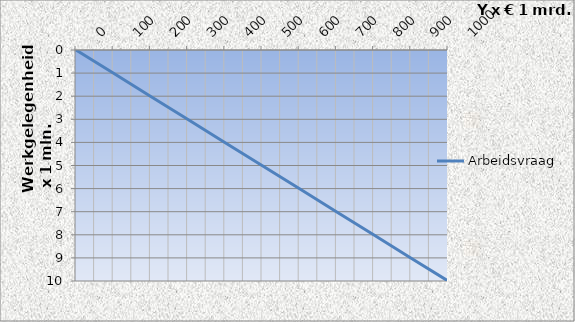
| Category | Arbeidsvraag |
|---|---|
| 0.0 | 0 |
| 100.0 | 1 |
| 200.0 | 2 |
| 300.0 | 3 |
| 400.0 | 4 |
| 500.0 | 5 |
| 600.0 | 6 |
| 700.0 | 7 |
| 800.0 | 8 |
| 900.0 | 9 |
| 1000.0 | 10 |